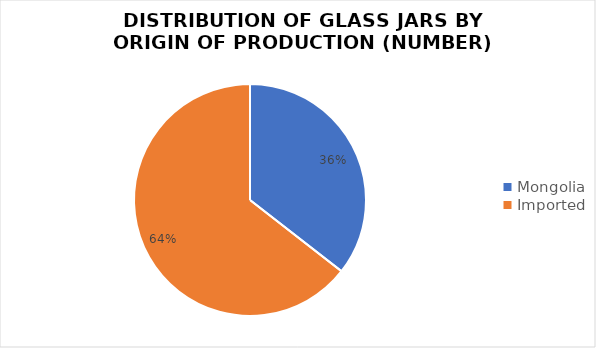
| Category | Series 0 |
|---|---|
| Mongolia | 227 |
| Imported | 412 |